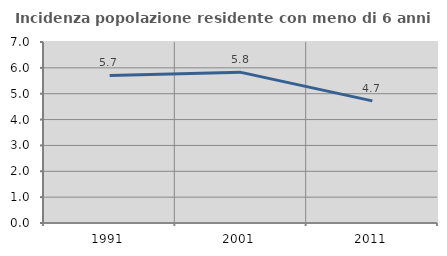
| Category | Incidenza popolazione residente con meno di 6 anni |
|---|---|
| 1991.0 | 5.707 |
| 2001.0 | 5.826 |
| 2011.0 | 4.724 |